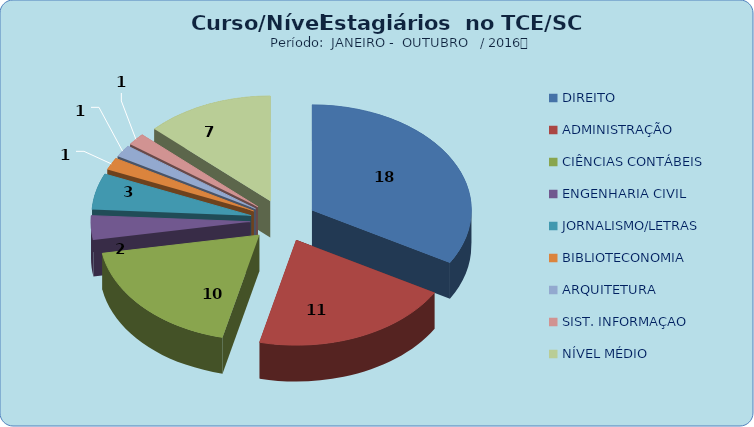
| Category | Series 0 |
|---|---|
| DIREITO | 18 |
| ADMINISTRAÇÃO | 11 |
| CIÊNCIAS CONTÁBEIS | 10 |
| ENGENHARIA CIVIL | 2 |
| JORNALISMO/LETRAS | 3 |
| BIBLIOTECONOMIA | 1 |
| ARQUITETURA | 1 |
| SIST. INFORMAÇAO | 1 |
| NÍVEL MÉDIO | 7 |